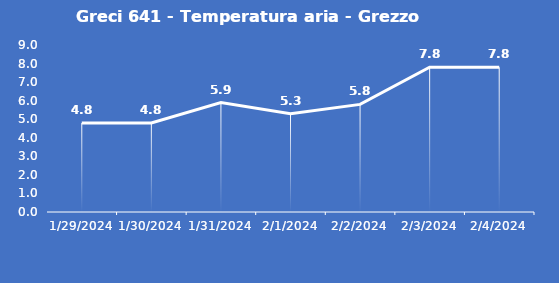
| Category | Greci 641 - Temperatura aria - Grezzo (°C) |
|---|---|
| 1/29/24 | 4.8 |
| 1/30/24 | 4.8 |
| 1/31/24 | 5.9 |
| 2/1/24 | 5.3 |
| 2/2/24 | 5.8 |
| 2/3/24 | 7.8 |
| 2/4/24 | 7.8 |